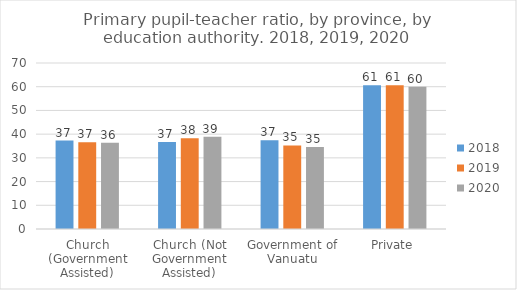
| Category | 2018 | 2019 | 2020 |
|---|---|---|---|
| Church (Government Assisted) | 37.294 | 36.547 | 36.325 |
| Church (Not Government Assisted) | 36.7 | 38.247 | 38.919 |
| Government of Vanuatu | 37.431 | 35.232 | 34.545 |
| Private | 60.667 | 60.667 | 60 |